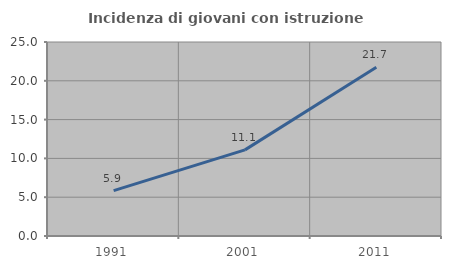
| Category | Incidenza di giovani con istruzione universitaria |
|---|---|
| 1991.0 | 5.854 |
| 2001.0 | 11.098 |
| 2011.0 | 21.748 |